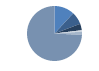
| Category | Series 0 |
|---|---|
| ARRASTRE | 56 |
| CERCO | 35 |
| PALANGRE | 18 |
| REDES DE ENMALLE | 4 |
| ARTES FIJAS | 9 |
| ARTES MENORES | 350 |